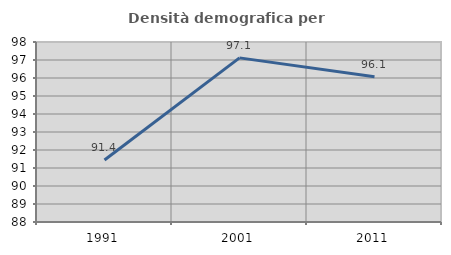
| Category | Densità demografica |
|---|---|
| 1991.0 | 91.444 |
| 2001.0 | 97.117 |
| 2011.0 | 96.076 |